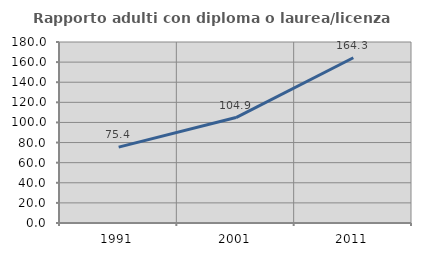
| Category | Rapporto adulti con diploma o laurea/licenza media  |
|---|---|
| 1991.0 | 75.415 |
| 2001.0 | 104.857 |
| 2011.0 | 164.338 |